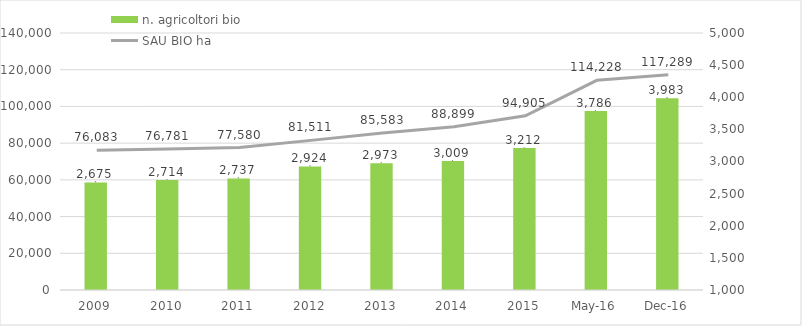
| Category | n. agricoltori bio |
|---|---|
| 2009.0 | 2675 |
| 2010.0 | 2714 |
| 2011.0 | 2737 |
| 2012.0 | 2924 |
| 2013.0 | 2973 |
| 2014.0 | 3009 |
| 2015.0 | 3212 |
| 42491.0 | 3786 |
| 42735.0 | 3983 |